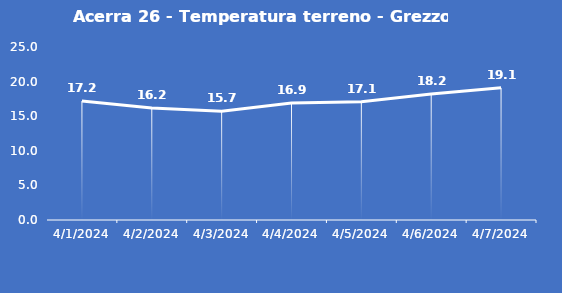
| Category | Acerra 26 - Temperatura terreno - Grezzo (°C) |
|---|---|
| 4/1/24 | 17.2 |
| 4/2/24 | 16.2 |
| 4/3/24 | 15.7 |
| 4/4/24 | 16.9 |
| 4/5/24 | 17.1 |
| 4/6/24 | 18.2 |
| 4/7/24 | 19.1 |